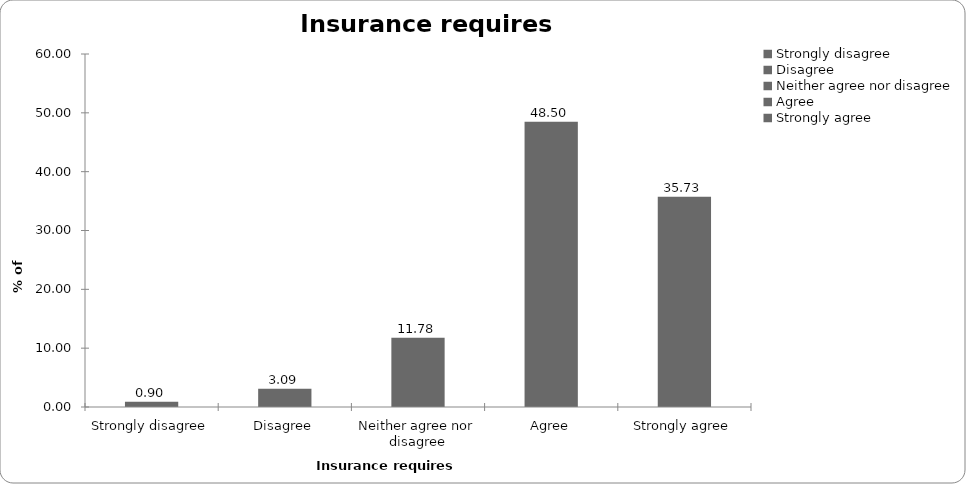
| Category | Insurance requires regulation |
|---|---|
| Strongly disagree | 0.898 |
| Disagree | 3.094 |
| Neither agree nor disagree | 11.776 |
| Agree | 48.503 |
| Strongly agree | 35.729 |